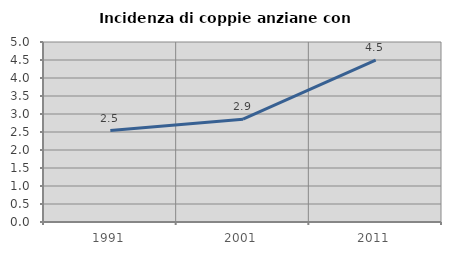
| Category | Incidenza di coppie anziane con figli |
|---|---|
| 1991.0 | 2.539 |
| 2001.0 | 2.855 |
| 2011.0 | 4.499 |